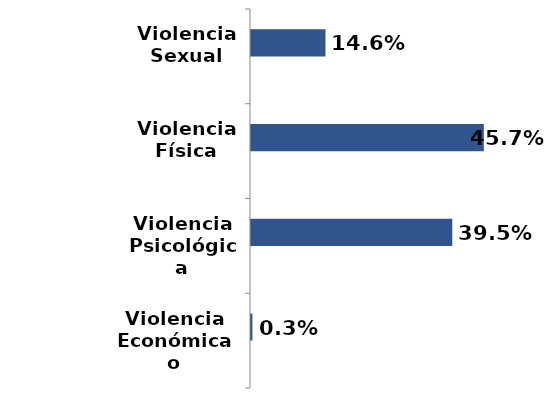
| Category | Series 0 | Series 1 |
|---|---|---|
| Violencia
Económica o Patrimonial |  | 0.003 |
| Violencia
Psicológica |  | 0.395 |
| Violencia
Física |  | 0.457 |
| Violencia
Sexual |  | 0.146 |